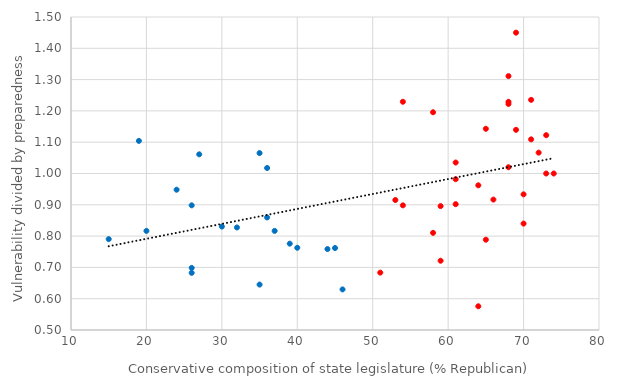
| Category | Vulnerability/Preparedness |
|---|---|
| 74.0 | 1 |
| 46.0 | 0.63 |
| 53.0 | 0.915 |
| 71.0 | 1.109 |
| 24.0 | 0.948 |
| 35.0 | 0.645 |
| 30.0 | 0.831 |
| 36.0 | 0.86 |
| nan | 0.763 |
| 71.0 | 1.235 |
| 65.0 | 1.143 |
| 19.0 | 1.104 |
| 70.0 | 0.84 |
| 37.0 | 0.817 |
| 73.0 | 1 |
| 69.0 | 1.14 |
| 64.0 | 0.962 |
| 68.0 | 1.229 |
| 61.0 | 1.035 |
| 40.0 | 0.763 |
| 26.0 | 0.698 |
| 15.0 | 0.79 |
| 58.0 | 0.81 |
| 44.0 | 0.759 |
| 68.0 | 1.311 |
| 61.0 | 0.982 |
| 59.0 | 0.896 |
| 61.0 | 0.902 |
| 35.0 | 1.065 |
| 51.0 | 0.683 |
| 27.0 | 1.061 |
| 36.0 | 1.018 |
| 26.0 | 0.898 |
| 66.0 | 0.917 |
| 65.0 | 0.788 |
| 68.0 | 1.02 |
| 68.0 | 1.222 |
| 32.0 | 0.828 |
| 54.0 | 0.898 |
| 20.0 | 0.817 |
| 54.0 | 1.229 |
| 72.0 | 1.067 |
| 73.0 | 1.122 |
| 58.0 | 1.196 |
| 64.0 | 0.576 |
| 26.0 | 0.683 |
| 45.0 | 0.762 |
| 39.0 | 0.776 |
| 69.0 | 1.45 |
| 59.0 | 0.721 |
| 70.0 | 0.933 |